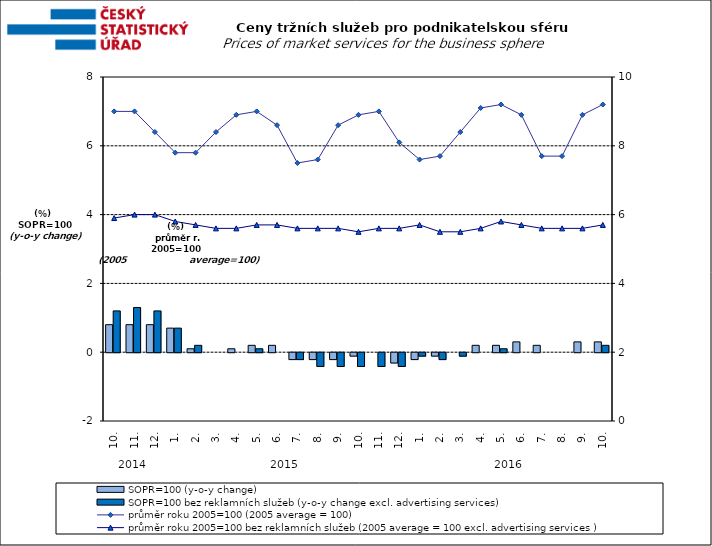
| Category | SOPR=100 (y-o-y change)   | SOPR=100 bez reklamních služeb (y-o-y change excl. advertising services)   |
|---|---|---|
| 0 | 0.8 | 1.2 |
| 1 | 0.8 | 1.3 |
| 2 | 0.8 | 1.2 |
| 3 | 0.7 | 0.7 |
| 4 | 0.1 | 0.2 |
| 5 | 0 | 0 |
| 6 | 0.1 | 0 |
| 7 | 0.2 | 0.1 |
| 8 | 0.2 | 0 |
| 9 | -0.2 | -0.2 |
| 10 | -0.2 | -0.4 |
| 11 | -0.2 | -0.4 |
| 12 | -0.1 | -0.4 |
| 13 | 0 | -0.4 |
| 14 | -0.3 | -0.4 |
| 15 | -0.2 | -0.1 |
| 16 | -0.1 | -0.2 |
| 17 | 0 | -0.1 |
| 18 | 0.2 | 0 |
| 19 | 0.2 | 0.1 |
| 20 | 0.3 | 0 |
| 21 | 0.2 | 0 |
| 22 | 0 | 0 |
| 23 | 0.3 | 0 |
| 24 | 0.3 | 0.2 |